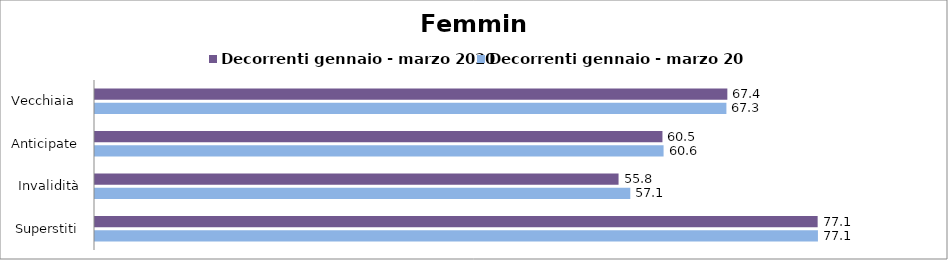
| Category | Decorrenti gennaio - marzo 2020 | Decorrenti gennaio - marzo 2021 |
|---|---|---|
| Vecchiaia  | 67.43 | 67.33 |
| Anticipate | 60.51 | 60.63 |
| Invalidità | 55.83 | 57.08 |
| Superstiti | 77.06 | 77.09 |